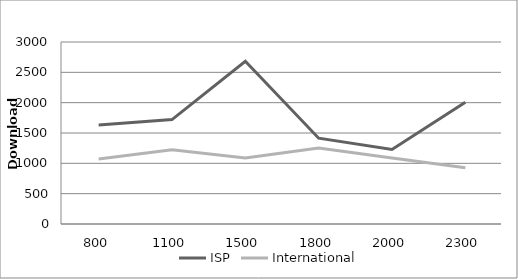
| Category | ISP | International |
|---|---|---|
| 800.0 | 1633 | 1070 |
| 1100.0 | 1720.571 | 1225.286 |
| 1500.0 | 2682.667 | 1087.167 |
| 1800.0 | 1414.714 | 1251.714 |
| 2000.0 | 1227.667 | 1088.167 |
| 2300.0 | 2008 | 927.167 |